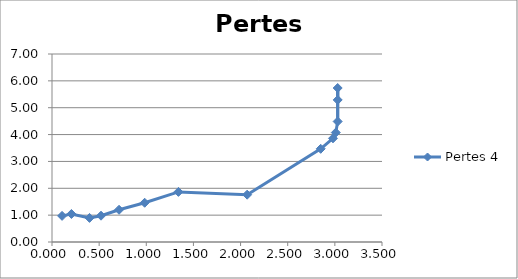
| Category | Pertes 4 |
|---|---|
| 3.03 | 5.29 |
| 3.03 | 5.733 |
| 3.03 | 4.487 |
| 3.01 | 4.075 |
| 2.98 | 3.86 |
| 2.85 | 3.47 |
| 2.07 | 1.762 |
| 1.341 | 1.865 |
| 0.983 | 1.461 |
| 0.711 | 1.2 |
| 0.52 | 0.979 |
| 0.398 | 0.897 |
| 0.206 | 1.043 |
| 0.107 | 0.973 |